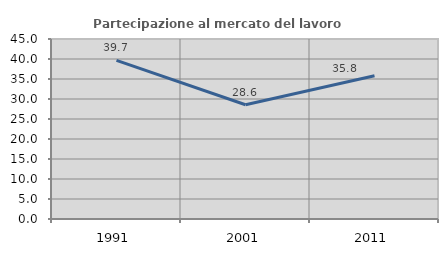
| Category | Partecipazione al mercato del lavoro  femminile |
|---|---|
| 1991.0 | 39.655 |
| 2001.0 | 28.571 |
| 2011.0 | 35.821 |